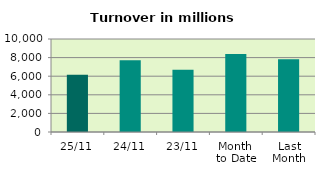
| Category | Series 0 |
|---|---|
| 25/11 | 6161.853 |
| 24/11 | 7727.061 |
| 23/11 | 6697.869 |
| Month 
to Date | 8374.374 |
| Last
Month | 7813.06 |